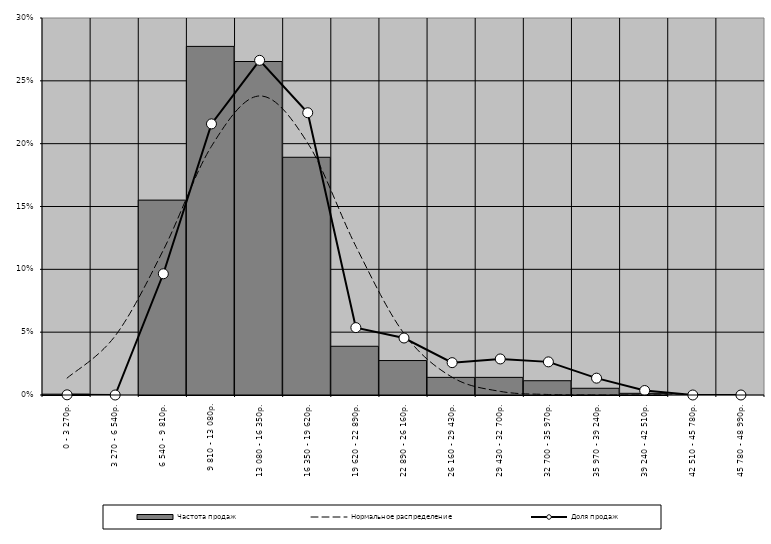
| Category | Частота продаж |
|---|---|
| 0 - 3 270р. | 0.001 |
| 3 270 - 6 540р. | 0 |
| 6 540 - 9 810р. | 0.155 |
| 9 810 - 13 080р. | 0.277 |
| 13 080 - 16 350р. | 0.265 |
| 16 350 - 19 620р. | 0.189 |
| 19 620 - 22 890р. | 0.039 |
| 22 890 - 26 160р. | 0.027 |
| 26 160 - 29 430р. | 0.014 |
| 29 430 - 32 700р. | 0.014 |
| 32 700 - 35 970р. | 0.011 |
| 35 970 - 39 240р. | 0.005 |
| 39 240 - 42 510р. | 0.001 |
| 42 510 - 45 780р. | 0 |
| 45 780 - 48 990р. | 0 |